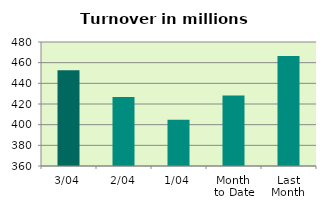
| Category | Series 0 |
|---|---|
| 3/04 | 452.755 |
| 2/04 | 426.841 |
| 1/04 | 404.812 |
| Month 
to Date | 428.136 |
| Last
Month | 466.511 |